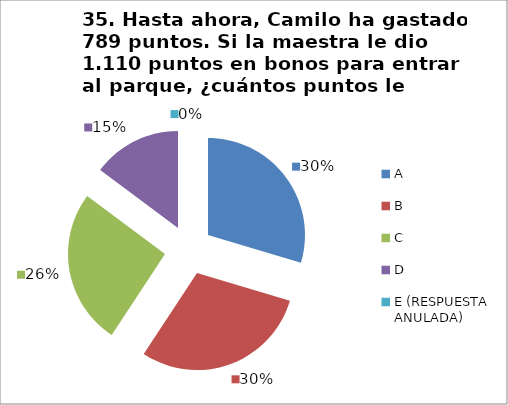
| Category | CANTIDAD DE RESPUESTAS PREGUNTA (35) | PORCENTAJE |
|---|---|---|
| A | 8 | 0.296 |
| B | 8 | 0.296 |
| C | 7 | 0.259 |
| D | 4 | 0.148 |
| E (RESPUESTA ANULADA) | 0 | 0 |